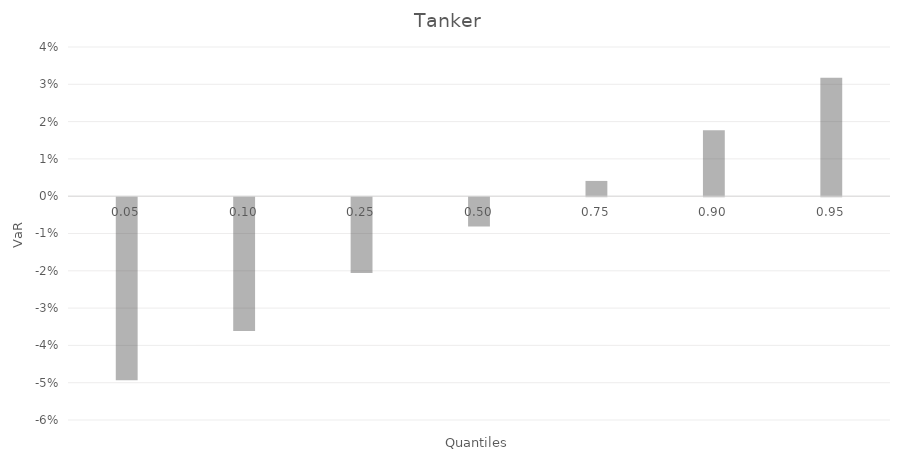
| Category | Series 0 |
|---|---|
| 0.05 | -0.049 |
| 0.1 | -0.036 |
| 0.25 | -0.02 |
| 0.5 | -0.008 |
| 0.75 | 0.004 |
| 0.9 | 0.018 |
| 0.95 | 0.032 |